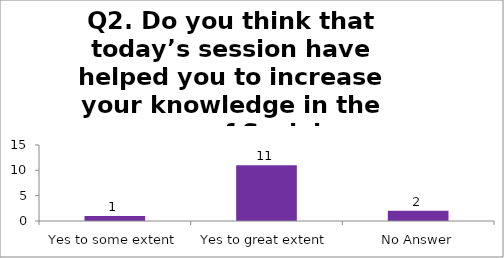
| Category | Q2. Do you think that today’s session have helped you to increase your knowledge in the area of Social Entrepreneurship? |
|---|---|
| Yes to some extent | 1 |
| Yes to great extent | 11 |
| No Answer | 2 |